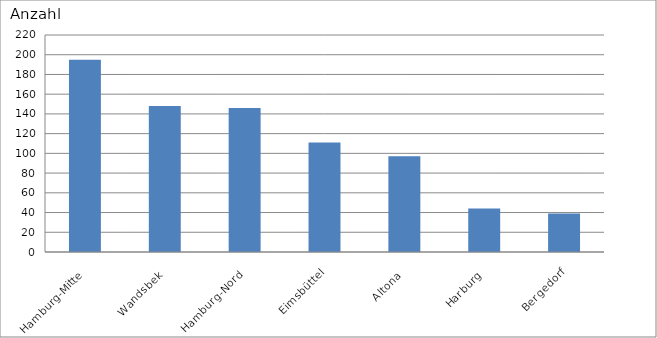
| Category | Hamburg-Mitte |
|---|---|
| Hamburg-Mitte | 195 |
| Wandsbek | 148 |
| Hamburg-Nord | 146 |
| Eimsbüttel | 111 |
| Altona | 97 |
| Harburg | 44 |
| Bergedorf | 39 |